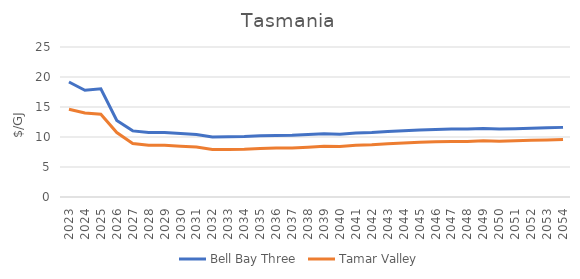
| Category | Bell Bay Three | Tamar Valley |
|---|---|---|
| 2023.0 | 19.167 | 14.629 |
| 2024.0 | 17.778 | 14.015 |
| 2025.0 | 18.032 | 13.803 |
| 2026.0 | 12.747 | 10.747 |
| 2027.0 | 11.02 | 8.92 |
| 2028.0 | 10.74 | 8.64 |
| 2029.0 | 10.732 | 8.632 |
| 2030.0 | 10.576 | 8.476 |
| 2031.0 | 10.428 | 8.328 |
| 2032.0 | 10.014 | 7.914 |
| 2033.0 | 10.037 | 7.937 |
| 2034.0 | 10.075 | 7.975 |
| 2035.0 | 10.188 | 8.088 |
| 2036.0 | 10.264 | 8.164 |
| 2037.0 | 10.284 | 8.184 |
| 2038.0 | 10.398 | 8.298 |
| 2039.0 | 10.547 | 8.447 |
| 2040.0 | 10.46 | 8.41 |
| 2041.0 | 10.676 | 8.626 |
| 2042.0 | 10.749 | 8.699 |
| 2043.0 | 10.927 | 8.877 |
| 2044.0 | 11.054 | 9.004 |
| 2045.0 | 11.17 | 9.12 |
| 2046.0 | 11.265 | 9.215 |
| 2047.0 | 11.317 | 9.267 |
| 2048.0 | 11.314 | 9.264 |
| 2049.0 | 11.409 | 9.359 |
| 2050.0 | 11.314 | 9.294 |
| 2051.0 | 11.386 | 9.366 |
| 2052.0 | 11.458 | 9.439 |
| 2053.0 | 11.531 | 9.513 |
| 2054.0 | 11.604 | 9.587 |